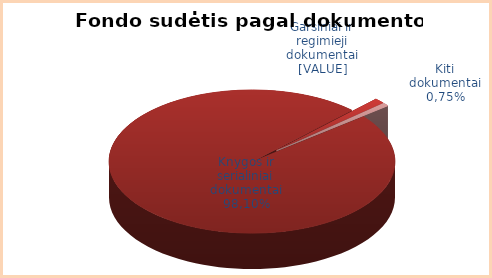
| Category | Series 0 |
|---|---|
| Garsiniai | 0.981 |
| Knygos | 0.012 |
| Kiti | 0.008 |